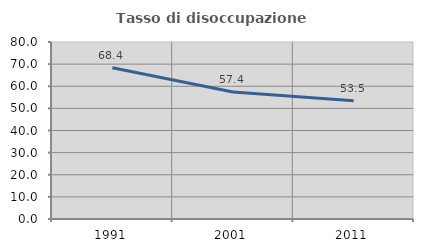
| Category | Tasso di disoccupazione giovanile  |
|---|---|
| 1991.0 | 68.382 |
| 2001.0 | 57.377 |
| 2011.0 | 53.488 |